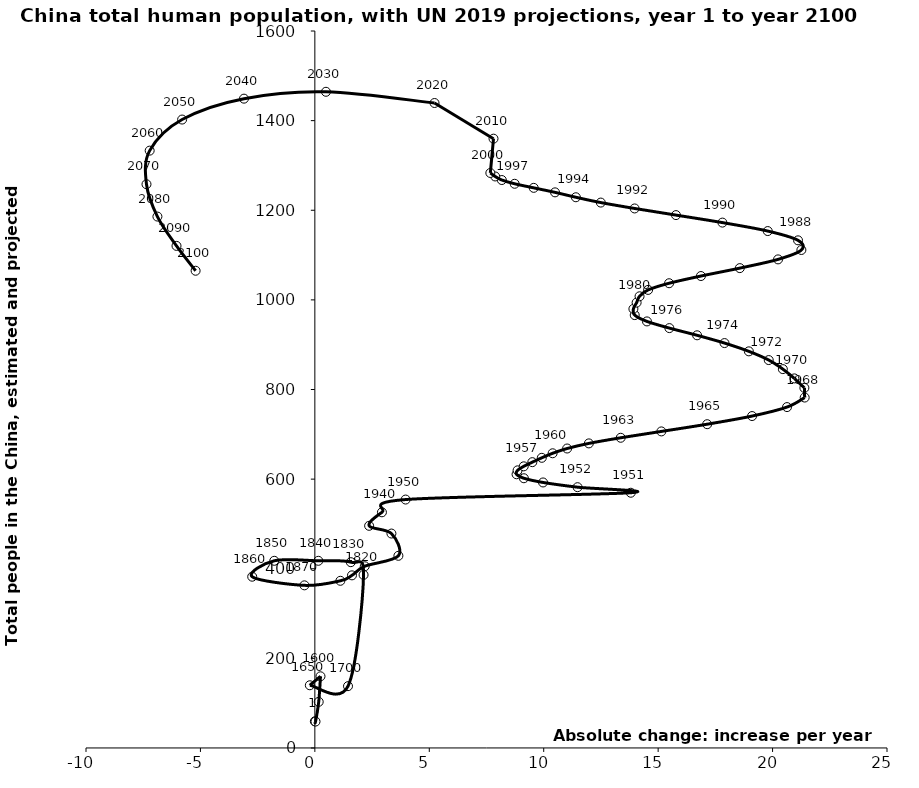
| Category | Series 0 |
|---|---|
| -0.0006000000000000015 | 59.6 |
| 0.02895263509006004 | 59 |
| 0.16833333333333333 | 103 |
| 0.24666666666666667 | 160 |
| -0.22 | 140 |
| 1.448812820337667 | 138 |
| 2.128365745973712 | 386.298 |
| 1.571554273383137 | 414.688 |
| 0.15208589742417472 | 417.729 |
| -1.7743354699487042 | 417.729 |
| -2.7375461536351424 | 382.243 |
| -0.4562576922725242 | 362.978 |
| 1.1152965811106128 | 373.117 |
| 1.6222495725245296 | 385.284 |
| 2.179897863079836 | 405.562 |
| 3.650061538180188 | 428.882 |
| 3.3458897433318384 | 478.564 |
| 2.3710191408428782 | 495.8 |
| 2.9309624698595487 | 525.984 |
| 3.9660971171278705 | 554.419 |
| 13.80501300000003 | 569.611 |
| 11.478392999999983 | 582.029 |
| 9.970958499999995 | 592.568 |
| 9.133267499999988 | 601.971 |
| 8.81316449999997 | 610.834 |
| 8.858504500000038 | 619.598 |
| 9.128031000000021 | 628.551 |
| 9.502278999999987 | 637.854 |
| 9.916267000000005 | 647.556 |
| 10.389466999999968 | 657.686 |
| 11.023085999999978 | 668.335 |
| 11.972796500000015 | 679.732 |
| 13.364319000000023 | 692.28 |
| 15.14084650000001 | 706.461 |
| 17.14234449999998 | 722.562 |
| 19.10444000000001 | 740.746 |
| 20.63154350000002 | 760.771 |
| 21.40307899999999 | 782.009 |
| 21.38986399999999 | 803.577 |
| 20.952178500000002 | 824.788 |
| 20.449036499999977 | 845.482 |
| 19.8321775 | 865.687 |
| 18.963504 | 885.146 |
| 17.89957499999997 | 903.614 |
| 16.702357000000006 | 920.945 |
| 15.491180500000041 | 937.018 |
| 14.510784999999998 | 951.927 |
| 13.976587499999994 | 966.04 |
| 13.918744000000004 | 979.881 |
| 14.059766499999967 | 993.877 |
| 14.188042999999993 | 1008 |
| 14.561841000000015 | 1022.253 |
| 15.47866950000008 | 1037.124 |
| 16.869777500000055 | 1053.211 |
| 18.568660499999964 | 1070.863 |
| 20.23916799999995 | 1090.348 |
| 21.259143999999992 | 1111.342 |
| 21.112084500000037 | 1132.866 |
| 19.789428000000044 | 1153.566 |
| 17.808813999999984 | 1172.445 |
| 15.779350499999964 | 1189.184 |
| 13.972805499999936 | 1204.004 |
| 12.494015499999932 | 1217.129 |
| 11.405435500000067 | 1228.992 |
| 10.494754499999999 | 1239.94 |
| 9.563485000000014 | 1249.981 |
| 8.730031000000054 | 1259.067 |
| 8.169862499999908 | 1267.442 |
| 7.878733499999953 | 1275.407 |
| 7.668036636363653 | 1283.199 |
| 7.806240300000025 | 1359.755 |
| 5.229252850000035 | 1439.324 |
| 0.48538234999994073 | 1464.34 |
| -3.0967494500000385 | 1449.031 |
| -5.800039599999934 | 1402.405 |
| -7.217547200000013 | 1333.031 |
| -7.356966500000067 | 1258.054 |
| -6.8793646999999964 | 1185.891 |
| -6.0448920999999585 | 1120.467 |
| -5.2104194999999205 | 1064.993 |